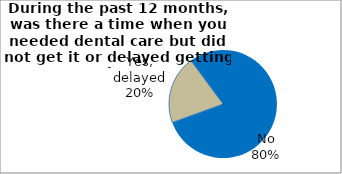
| Category | Series 0 |
|---|---|
| Yes, delayed | 20.425 |
| No | 79.575 |